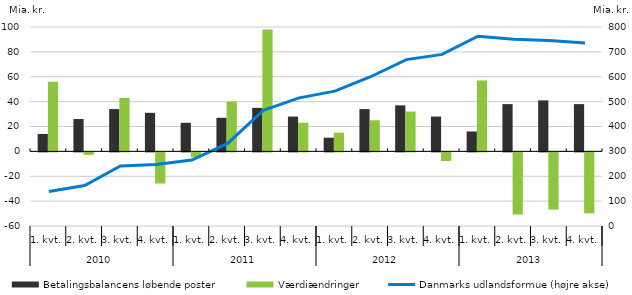
| Category | Betalingsbalancens løbende poster | Værdiændringer |
|---|---|---|
| 0 | 14 | 56 |
| 1 | 26 | -2 |
| 2 | 34 | 43 |
| 3 | 31 | -25 |
| 4 | 23 | -4 |
| 5 | 27 | 40 |
| 6 | 35 | 98 |
| 7 | 28 | 23 |
| 8 | 11 | 15 |
| 9 | 34 | 25 |
| 10 | 37 | 32 |
| 11 | 28 | -7 |
| 12 | 16 | 57 |
| 13 | 38 | -50 |
| 14 | 41 | -46 |
| 15 | 38 | -49 |